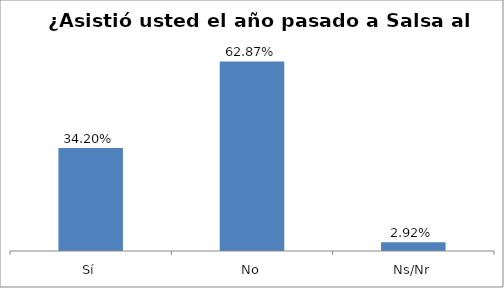
| Category | Total |
|---|---|
| Sí | 0.342 |
| No | 0.629 |
| Ns/Nr | 0.029 |